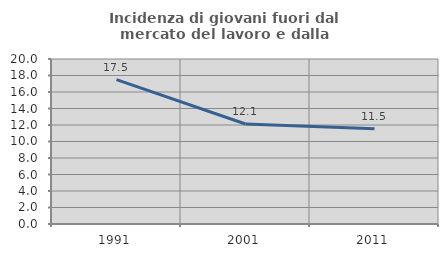
| Category | Incidenza di giovani fuori dal mercato del lavoro e dalla formazione  |
|---|---|
| 1991.0 | 17.5 |
| 2001.0 | 12.121 |
| 2011.0 | 11.538 |